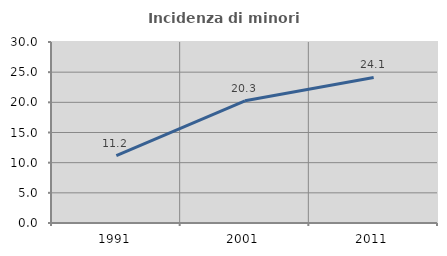
| Category | Incidenza di minori stranieri |
|---|---|
| 1991.0 | 11.151 |
| 2001.0 | 20.259 |
| 2011.0 | 24.124 |